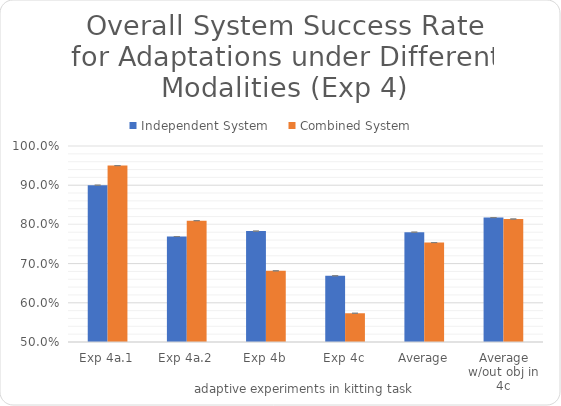
| Category | Independent System | Combined System |
|---|---|---|
| Exp 4a.1 | 0.9 | 0.95 |
| Exp 4a.2 | 0.769 | 0.81 |
| Exp 4b | 0.783 | 0.682 |
| Exp 4c | 0.669 | 0.573 |
| Average | 0.78 | 0.754 |
| Average w/out obj in 4c | 0.817 | 0.814 |